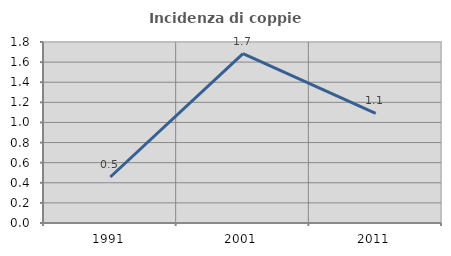
| Category | Incidenza di coppie miste |
|---|---|
| 1991.0 | 0.458 |
| 2001.0 | 1.684 |
| 2011.0 | 1.091 |